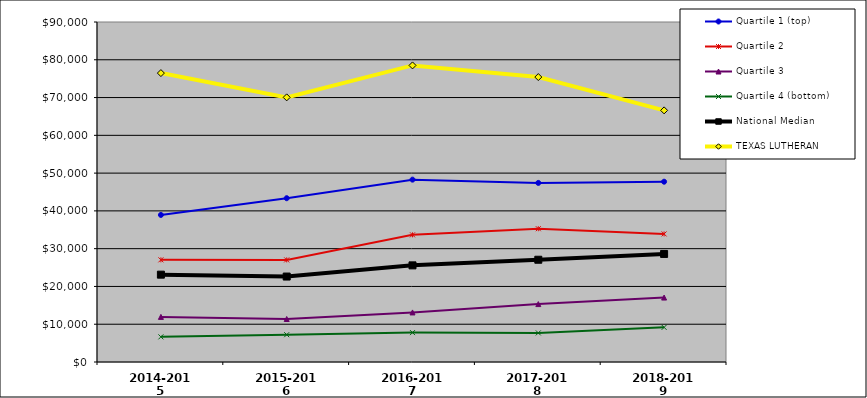
| Category | Quartile 1 (top) | Quartile 2 | Quartile 3 | Quartile 4 (bottom) | National Median | TEXAS LUTHERAN |
|---|---|---|---|---|---|---|
| 2014-2015 | 38930.439 | 27040.756 | 11941.201 | 6651.32 | 23117.708 | 76478.341 |
| 2015-2016 | 43356.297 | 27028.711 | 11380.392 | 7228.105 | 22619.893 | 70047.888 |
| 2016-2017 | 48270.762 | 33663.128 | 13122.444 | 7780.796 | 25581.053 | 78508.712 |
| 2017-2018 | 47405.236 | 35284.051 | 15329.141 | 7699.823 | 27067.87 | 75423 |
| 2018-2019 | 47724.097 | 33902.539 | 17060.229 | 9171.888 | 28604.166 | 66606.85 |